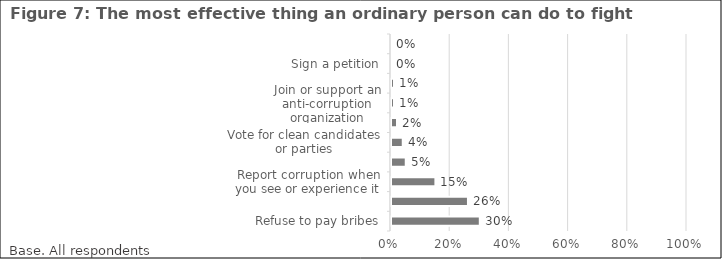
| Category | Series 0 |
|---|---|
| Refuse to pay bribes | 0.3 |
| Ordinary people cannot do anything  | 0.26 |
| Report corruption when you see or experience it | 0.15 |
| Speak out about the problem | 0.05 |
| Vote for clean candidates or parties | 0.04 |
| Talk to friends and relatives  | 0.02 |
| Join or support an anti-corruption organization | 0.01 |
| Boycott a corrupt business | 0.01 |
| Sign a petition | 0 |
| Participate in protest marches or demonstrations | 0 |